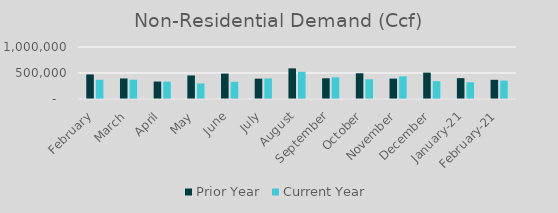
| Category | Prior Year | Current Year |
|---|---|---|
| February | 472459.203 | 369131.684 |
| March | 394966.802 | 370961.851 |
| April | 335781.44 | 333800.488 |
| May | 452130.67 | 299245.56 |
| June | 488107.52 | 330441.187 |
| July | 390975.65 | 394304.316 |
| August | 588468.22 | 522963.473 |
| September | 398263 | 416886.629 |
| October | 494775 | 379515 |
| November | 392357 | 434815 |
| December | 507022 | 342584.594 |
| January-21 | 400923.849 | 322657.16 |
| February-21 | 369131.684 | 354041 |